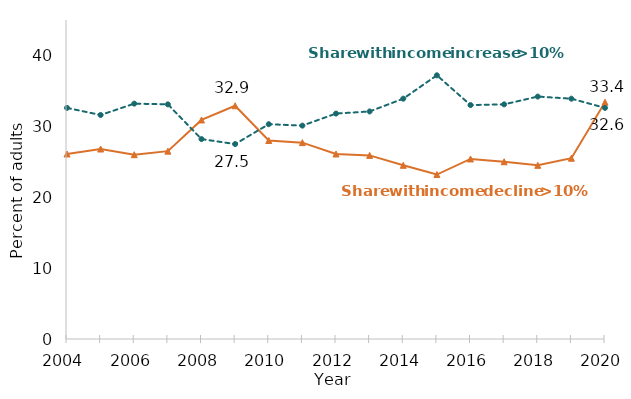
| Category | Share decline 10% or more | Share increase 10% or more |
|---|---|---|
| 2004.0 | 26.1 | 32.6 |
| 2005.0 | 26.8 | 31.6 |
| 2006.0 | 26 | 33.2 |
| 2007.0 | 26.5 | 33.1 |
| 2008.0 | 30.9 | 28.2 |
| 2009.0 | 32.9 | 27.5 |
| 2010.0 | 28 | 30.3 |
| 2011.0 | 27.7 | 30.1 |
| 2012.0 | 26.1 | 31.8 |
| 2013.0 | 25.9 | 32.1 |
| 2014.0 | 24.5 | 33.9 |
| 2015.0 | 23.2 | 37.2 |
| 2016.0 | 25.4 | 33 |
| 2017.0 | 25 | 33.1 |
| 2018.0 | 24.5 | 34.2 |
| 2019.0 | 25.5 | 33.9 |
| 2020.0 | 33.4 | 32.6 |